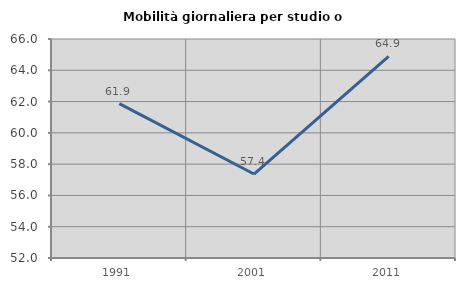
| Category | Mobilità giornaliera per studio o lavoro |
|---|---|
| 1991.0 | 61.867 |
| 2001.0 | 57.368 |
| 2011.0 | 64.888 |